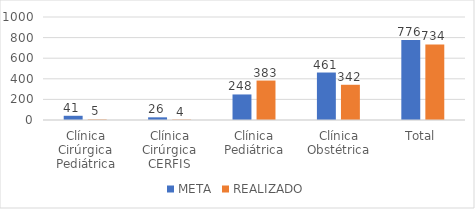
| Category | META | REALIZADO |
|---|---|---|
| Clínica Cirúrgica Pediátrica | 41 | 5 |
| Clínica Cirúrgica CERFIS | 26 | 4 |
| Clínica Pediátrica | 248 | 383 |
| Clínica Obstétrica | 461 | 342 |
| Total | 776 | 734 |